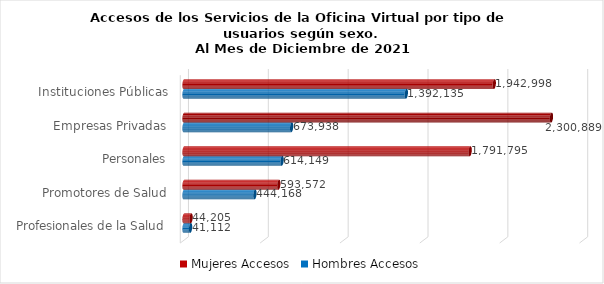
| Category | Mujeres | Hombres |
|---|---|---|
| Instituciones Públicas | 1942998 | 1392135 |
| Empresas Privadas | 2300889 | 673938 |
| Personales | 1791795 | 614149 |
| Promotores de Salud | 593572 | 444168 |
| Profesionales de la Salud | 44205 | 41112 |